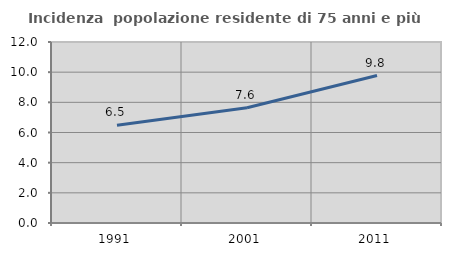
| Category | Incidenza  popolazione residente di 75 anni e più |
|---|---|
| 1991.0 | 6.477 |
| 2001.0 | 7.637 |
| 2011.0 | 9.777 |